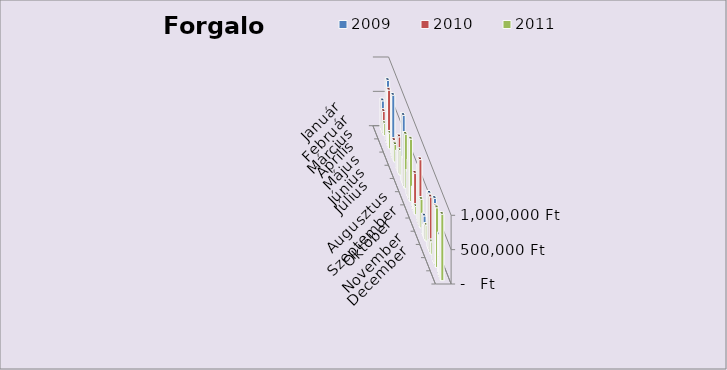
| Category | 2009 | 2010 | 2011 |
|---|---|---|---|
| Január | 426000 | 311000 | 176000 |
| Február | 915000 | 814000 | 226000 |
| Március | 892000 | 274000 | 253000 |
| Április | 246000 | 518000 | 357000 |
| Május | 982000 | 388000 | 787000 |
| Június | 346000 | 536000 | 909000 |
| Július | 295000 | 565000 | 119000 |
| Augusztus | 811000 | 954000 | 416000 |
| Szeptember | 287000 | 168000 | 230000 |
| Október | 810000 | 795000 | 181000 |
| November | 926000 | 850000 | 869000 |
| December | 587000 | 281000 | 967000 |